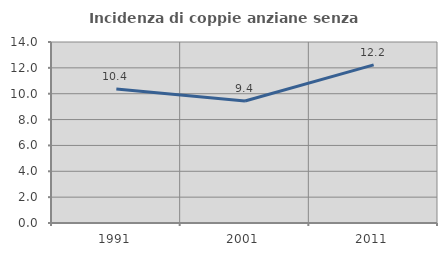
| Category | Incidenza di coppie anziane senza figli  |
|---|---|
| 1991.0 | 10.373 |
| 2001.0 | 9.437 |
| 2011.0 | 12.228 |